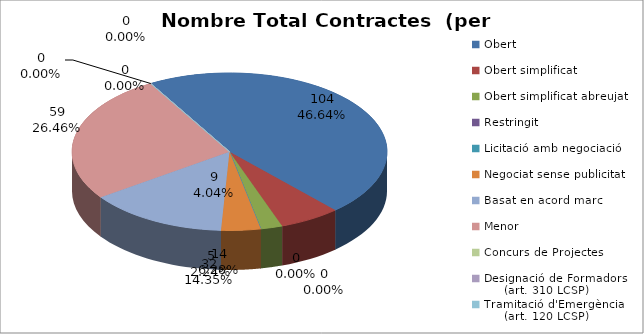
| Category | Nombre Total Contractes |
|---|---|
| Obert | 104 |
| Obert simplificat | 14 |
| Obert simplificat abreujat | 5 |
| Restringit | 0 |
| Licitació amb negociació | 0 |
| Negociat sense publicitat | 9 |
| Basat en acord marc | 32 |
| Menor | 59 |
| Concurs de Projectes | 0 |
| Designació de Formadors
     (art. 310 LCSP) | 0 |
| Tramitació d'Emergència
     (art. 120 LCSP) | 0 |